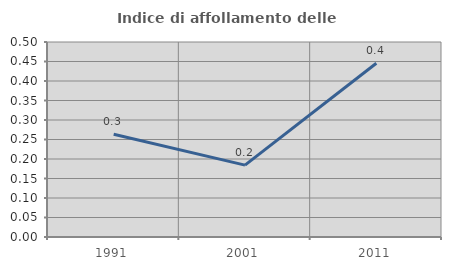
| Category | Indice di affollamento delle abitazioni  |
|---|---|
| 1991.0 | 0.263 |
| 2001.0 | 0.184 |
| 2011.0 | 0.446 |